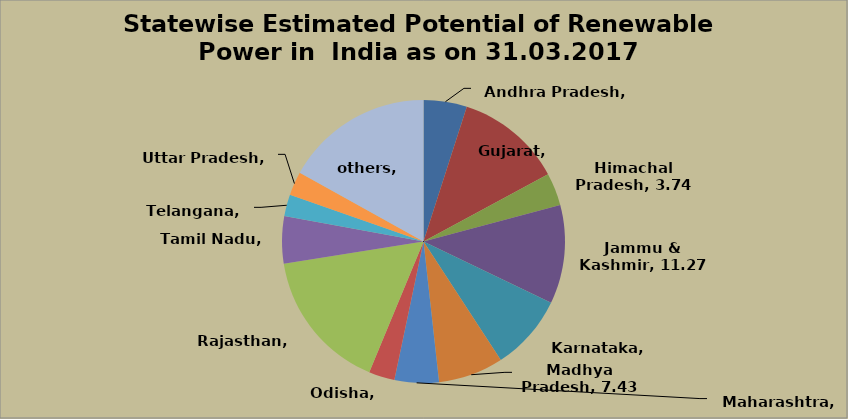
| Category | Series 0 |
|---|---|
| Andhra Pradesh | 4.953 |
| Gujarat | 12.165 |
| Himachal Pradesh | 3.74 |
| Jammu & Kashmir | 11.267 |
| Karnataka | 8.681 |
| Madhya Pradesh | 7.434 |
| Maharashtra | 5.064 |
| Odisha | 2.958 |
| Rajasthan | 16.214 |
| Tamil Nadu | 5.403 |
| Telangana | 2.483 |
| Uttar Pradesh | 2.703 |
| others | 16.933 |